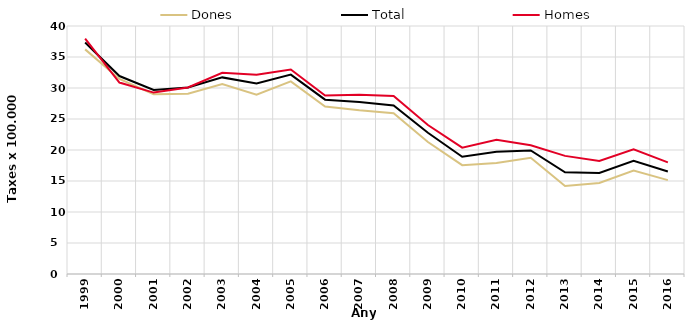
| Category | Dones | Total | Homes |
|---|---|---|---|
| 1999.0 | 36.23 | 37.34 | 37.97 |
| 2000.0 | 31.47 | 31.93 | 30.88 |
| 2001.0 | 29.01 | 29.69 | 29.26 |
| 2002.0 | 29.07 | 30.09 | 30.09 |
| 2003.0 | 30.63 | 31.71 | 32.46 |
| 2004.0 | 28.91 | 30.74 | 32.15 |
| 2005.0 | 31.06 | 32.16 | 32.98 |
| 2006.0 | 27.01 | 28.12 | 28.8 |
| 2007.0 | 26.4 | 27.75 | 28.91 |
| 2008.0 | 25.93 | 27.19 | 28.71 |
| 2009.0 | 21.29 | 22.78 | 24.03 |
| 2010.0 | 17.55 | 18.92 | 20.38 |
| 2011.0 | 17.92 | 19.73 | 21.65 |
| 2012.0 | 18.74 | 19.93 | 20.75 |
| 2013.0 | 14.19 | 16.41 | 19.05 |
| 2014.0 | 14.67 | 16.28 | 18.23 |
| 2015.0 | 16.67 | 18.25 | 20.13 |
| 2016.0 | 15.14 | 16.52 | 18 |